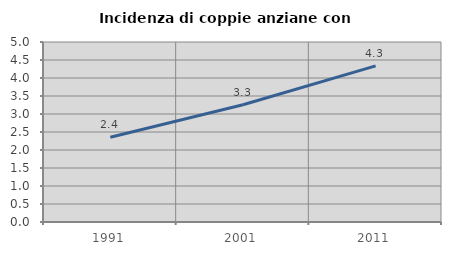
| Category | Incidenza di coppie anziane con figli |
|---|---|
| 1991.0 | 2.352 |
| 2001.0 | 3.256 |
| 2011.0 | 4.338 |